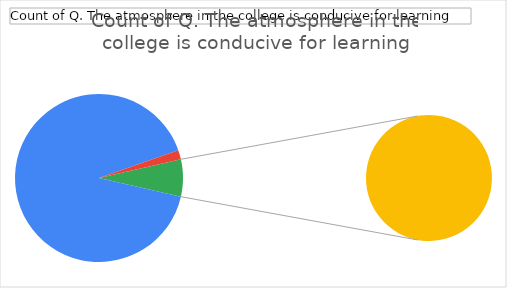
| Category | Total |
|---|---|
| Agree | 51 |
| Disagree | 1 |
| Neutral | 4 |